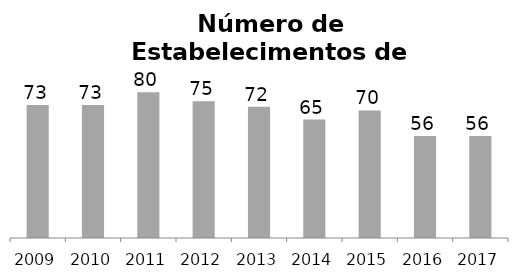
| Category | Transporte Terrestre |
|---|---|
| 2009.0 | 73 |
| 2010.0 | 73 |
| 2011.0 | 80 |
| 2012.0 | 75 |
| 2013.0 | 72 |
| 2014.0 | 65 |
| 2015.0 | 70 |
| 2016.0 | 56 |
| 2017.0 | 56 |